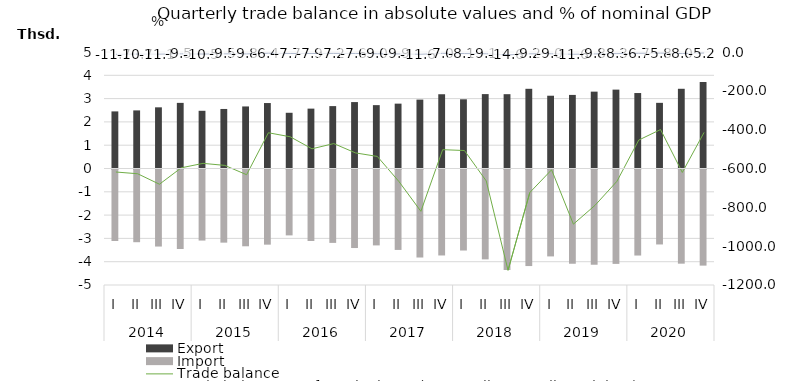
| Category | Export | Import |
|---|---|---|
| 0 | 2450.7 | -3068.8 |
| 1 | 2493.4 | -3120.5 |
| 2 | 2625.5 | -3306.5 |
| 3 | 2816.7 | -3413.2 |
| 4 | 2476.5 | -3050.1 |
| 5 | 2555.2 | -3139.2 |
| 6 | 2663.4 | -3295.5 |
| 7 | 2809.5 | -3225.4 |
| 8 | 2391.5 | -2828.1 |
| 9 | 2569.5 | -3068 |
| 10 | 2678.2 | -3149.9 |
| 11 | 2850.8 | -3370.5 |
| 12 | 2719.6 | -3257.4 |
| 13 | 2783.8 | -3452 |
| 14 | 2956.9 | -3777.4 |
| 15 | 3187 | -3690 |
| 16 | 2969.9 | -3477.4 |
| 17 | 3193.3 | -3857.4 |
| 18 | 3189.7 | -4313.9 |
| 19 | 3420.5 | -4144.2 |
| 20 | 3123.6 | -3730.2 |
| 21 | 3158.2 | -4044.8 |
| 22 | 3298.5 | -4087.5 |
| 23 | 3385.3 | -4051.1 |
| 24 | 3239 | -3692.6 |
| 25 | 2818 | -3217.4 |
| 26 | 3421.3 | -4041.6 |
| 27 | 3711.4 | -4125.4 |